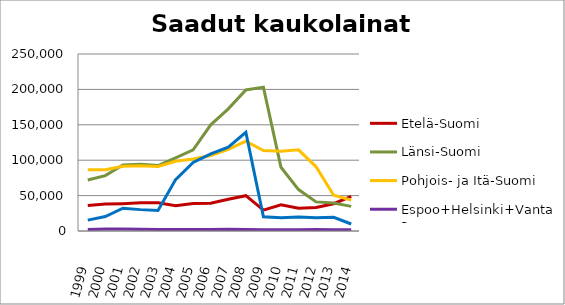
| Category | Etelä-Suomi | Länsi-Suomi | Pohjois- ja Itä-Suomi | Espoo+Helsinki+Vantaa | Muu Uusimaa |
|---|---|---|---|---|---|
| 1999.0 | 35869 | 71976 | 86488 | 2131 | 15391 |
| 2000.0 | 38041 | 78191 | 86457 | 2651 | 20380 |
| 2001.0 | 38660 | 93408 | 91378 | 2690 | 32137 |
| 2002.0 | 39786 | 94416 | 92315 | 2599 | 30193 |
| 2003.0 | 39782 | 92348 | 91198 | 2195 | 28862 |
| 2004.0 | 35686 | 103253 | 98440 | 2184 | 72649 |
| 2005.0 | 38952 | 114549 | 101789 | 2211 | 96816 |
| 2006.0 | 39121 | 150025 | 106608 | 2144 | 108856 |
| 2007.0 | 44894 | 172512 | 115192 | 2452 | 118537 |
| 2008.0 | 49850 | 199152 | 126866 | 2032 | 139503 |
| 2009.0 | 29529 | 203195 | 113546 | 1835 | 20044 |
| 2010.0 | 37137 | 89986 | 112598 | 1686 | 18759 |
| 2011.0 | 32200 | 58527 | 114676 | 1811 | 19850 |
| 2012.0 | 33074 | 41131 | 90648 | 1951 | 18583 |
| 2013.0 | 38554 | 39662 | 50430 | 1635 | 19324 |
| 2014.0 | 49024 | 34807 | 43624 | 1689 | 9915 |